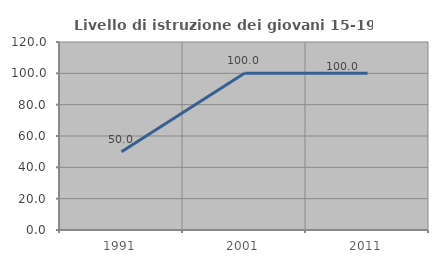
| Category | Livello di istruzione dei giovani 15-19 anni |
|---|---|
| 1991.0 | 50 |
| 2001.0 | 100 |
| 2011.0 | 100 |